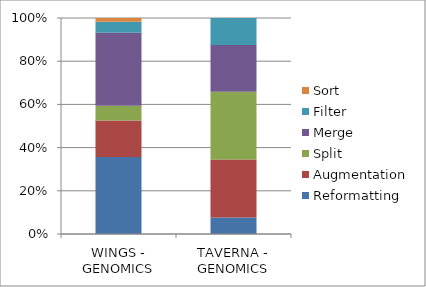
| Category | Reformatting | Augmentation | Split | Merge | Filter  | Sort |
|---|---|---|---|---|---|---|
| WINGS - GENOMICS | 21 | 10 | 4 | 20 | 3 | 1 |
| TAVERNA - GENOMICS | 19 | 67 | 78 | 54 | 31 | 0 |